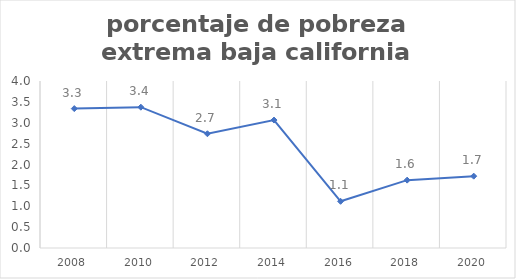
| Category | Series 0 |
|---|---|
| 2008.0 | 3.339 |
| 2010.0 | 3.373 |
| 2012.0 | 2.737 |
| 2014.0 | 3.065 |
| 2016.0 | 1.118 |
| 2018.0 | 1.625 |
| 2020.0 | 1.721 |